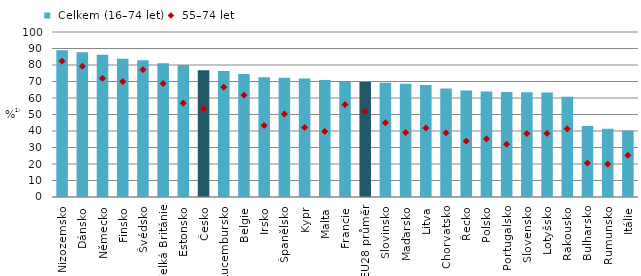
| Category |  Celkem (16–74 let) |
|---|---|
| Nizozemsko | 88.905 |
| Dánsko | 87.772 |
| Německo | 86.138 |
| Finsko | 83.767 |
| Švédsko | 82.915 |
| Velká Británie | 81.088 |
| Estonsko | 79.992 |
| Česko | 76.761 |
| Lucembursko | 76.384 |
| Belgie | 74.607 |
| Irsko | 72.554 |
| Španělsko | 72.337 |
| Kypr | 71.873 |
| Malta | 70.965 |
| Francie | 69.812 |
| EU28 průměr | 69.697 |
| Slovinsko | 69.252 |
| Maďarsko | 68.633 |
| Litva | 67.92 |
| Chorvatsko | 65.811 |
| Řecko | 64.567 |
| Polsko | 63.975 |
| Portugalsko | 63.577 |
| Slovensko | 63.515 |
| Lotyšsko | 63.266 |
| Rakousko | 60.791 |
| Bulharsko | 43.005 |
| Rumunsko | 41.43 |
| Itálie | 40.364 |